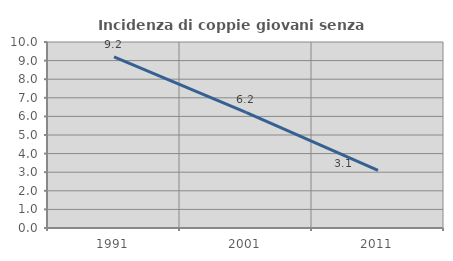
| Category | Incidenza di coppie giovani senza figli |
|---|---|
| 1991.0 | 9.206 |
| 2001.0 | 6.212 |
| 2011.0 | 3.102 |